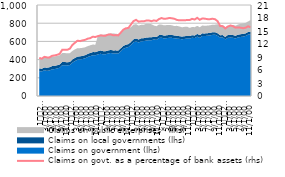
| Category | Claims on govt. as a percentage of bank assets (rhs) |
|---|---|
| 0 | 8.797 |
| 1900-01-01 | 8.62 |
| 1900-01-02 | 9.029 |
| 1900-01-03 | 8.913 |
| 1900-01-04 | 8.913 |
| 1900-01-05 | 9.266 |
| 1900-01-06 | 9.359 |
| 1900-01-07 | 9.5 |
| 1900-01-08 | 9.732 |
| 1900-01-09 | 10.661 |
| 1900-01-10 | 10.684 |
| 1900-01-11 | 10.671 |
| 1900-01-12 | 10.916 |
| 1900-01-13 | 11.783 |
| 1900-01-14 | 12.28 |
| 1900-01-15 | 12.763 |
| 1900-01-16 | 12.665 |
| 1900-01-17 | 12.836 |
| 1900-01-18 | 12.957 |
| 1900-01-19 | 13.236 |
| 1900-01-20 | 13.344 |
| 1900-01-21 | 13.689 |
| 1900-01-22 | 13.61 |
| 1900-01-23 | 13.823 |
| 1900-01-24 | 13.97 |
| 1900-01-25 | 13.925 |
| 1900-01-26 | 13.914 |
| 1900-01-27 | 14.155 |
| 1900-01-28 | 14.225 |
| 1900-01-29 | 14.009 |
| 1900-01-30 | 14.052 |
| 1900-01-31 | 13.985 |
| 1900-02-01 | 14.637 |
| 1900-02-02 | 15.313 |
| 1900-02-03 | 15.622 |
| 1900-02-04 | 15.712 |
| 1900-02-05 | 16.515 |
| 1900-02-06 | 17.298 |
| 1900-02-07 | 17.568 |
| 1900-02-08 | 17.155 |
| 1900-02-09 | 17.245 |
| 1900-02-10 | 17.242 |
| 1900-02-11 | 17.401 |
| 1900-02-12 | 17.435 |
| 1900-02-13 | 17.262 |
| 1900-02-14 | 17.456 |
| 1900-02-15 | 17.319 |
| 1900-02-16 | 17.757 |
| 1900-02-17 | 17.99 |
| 1900-02-18 | 17.808 |
| 1900-02-19 | 17.865 |
| 1900-02-20 | 18.004 |
| 1900-02-21 | 17.943 |
| 1900-02-22 | 17.83 |
| 1900-02-23 | 17.564 |
| 1900-02-24 | 17.456 |
| 1900-02-25 | 17.476 |
| 1900-02-26 | 17.471 |
| 1900-02-27 | 17.536 |
| 1900-02-28 | 17.516 |
| 1900-02-28 | 17.802 |
| 1900-03-01 | 17.655 |
| 1900-03-02 | 18.044 |
| 1900-03-03 | 17.585 |
| 1900-03-04 | 17.9 |
| 1900-03-05 | 17.844 |
| 1900-03-06 | 17.739 |
| 1900-03-07 | 17.73 |
| 1900-03-08 | 17.832 |
| 1900-03-09 | 17.71 |
| 1900-03-10 | 17.266 |
| 1900-03-11 | 16.151 |
| 1900-03-12 | 16.118 |
| 1900-03-13 | 15.587 |
| 1900-03-14 | 16.013 |
| 1900-03-15 | 16.265 |
| 1900-03-16 | 16.125 |
| 1900-03-17 | 15.774 |
| 1900-03-18 | 15.806 |
| 1900-03-19 | 15.773 |
| 1900-03-20 | 15.636 |
| 1900-03-21 | 15.77 |
| 1900-03-22 | 16.081 |
| 1900-03-23 | 15.835 |